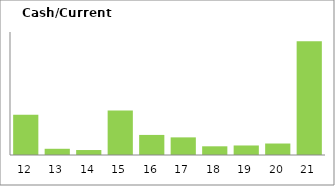
| Category | Cash/Current asset |
|---|---|
| 2012-03-31 | 0.261 |
| 2013-03-31 | 0.04 |
| 2014-03-31 | 0.032 |
| 2015-03-31 | 0.29 |
| 2016-03-31 | 0.131 |
| 2017-03-31 | 0.115 |
| 2018-03-31 | 0.057 |
| 2019-03-31 | 0.062 |
| 2020-03-31 | 0.075 |
| 2021-03-31 | 0.74 |